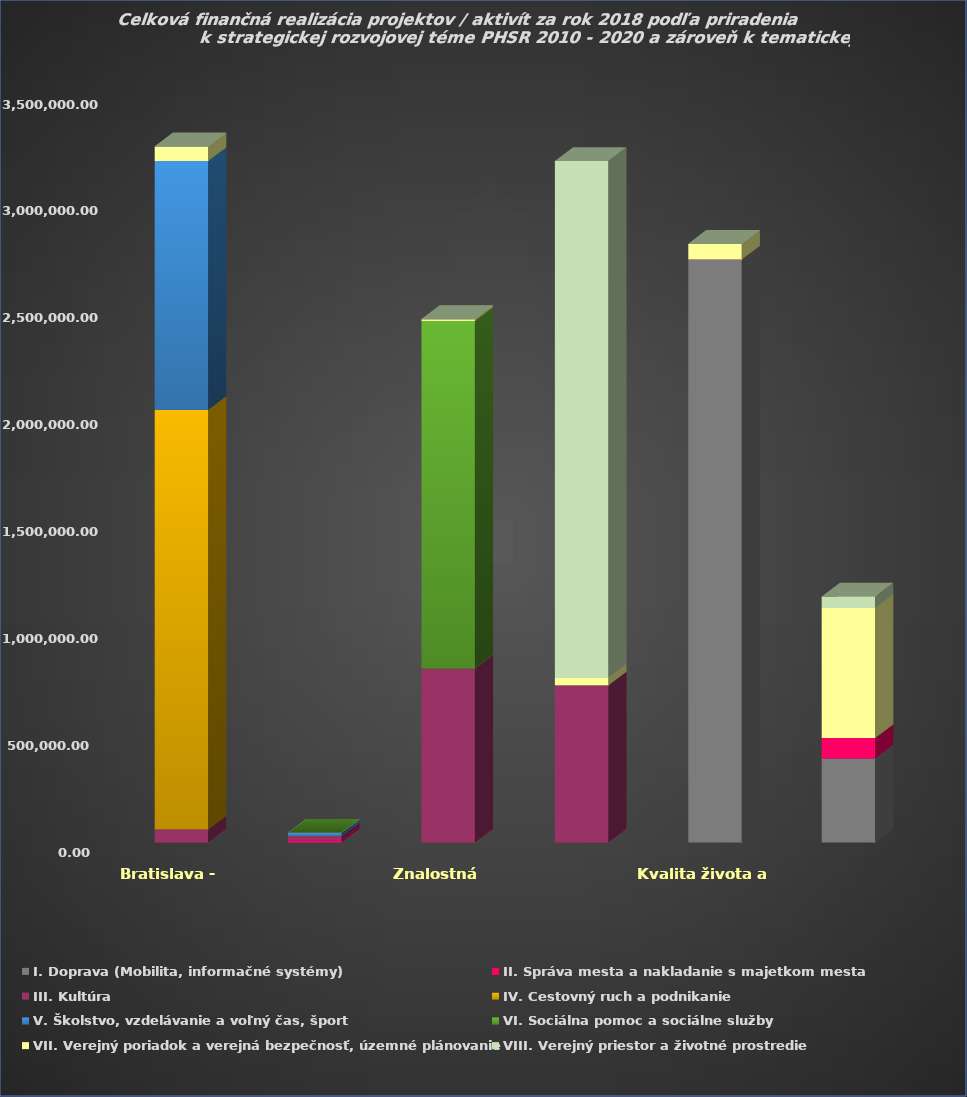
| Category | I. Doprava (Mobilita, informačné systémy) | II. Správa mesta a nakladanie s majetkom mesta | III. Kultúra | IV. Cestovný ruch a podnikanie | V. Školstvo, vzdelávanie a voľný čas, šport | VI. Sociálna pomoc a sociálne služby | VII. Verejný poriadok a verejná bezpečnosť, územné plánovanie | VIII. Verejný priestor a životné prostredie |
|---|---|---|---|---|---|---|---|---|
| Bratislava - nadregionálne centrum | 0 | 0 | 60936 | 1961943.8 | 1165000 | 0 | 67488.4 | 0 |
| Znalostná ekonomika | 0 | 10373.65 | 20000 | 0 | 15000 | 0 | 0 | 0 |
| Kvalita života a ľudské zdroje | 0 | 0 | 814035.88 | 0 | 0 | 1625196.45 | 8000 | 0 |
| Kvalita životného prostredia a meststkého priestoru | 0 | 0 | 735847 | 0 | 0 | 0 | 34398.42 | 2417484.15 |
| Doprava a technická infraštruktúra | 2727050.6 | 0 | 0 | 0 | 0 | 0 | 72999.9 | 0 |
| Správa a riadenie mesta | 393076.1 | 96060 | 0 | 0 | 0 | 0 | 607463.47 | 54000 |